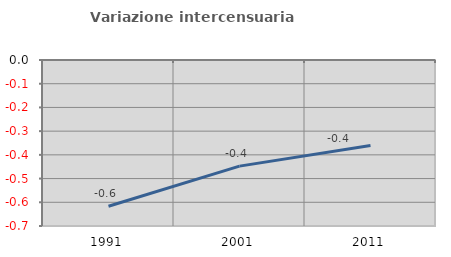
| Category | Variazione intercensuaria annua |
|---|---|
| 1991.0 | -0.617 |
| 2001.0 | -0.448 |
| 2011.0 | -0.36 |